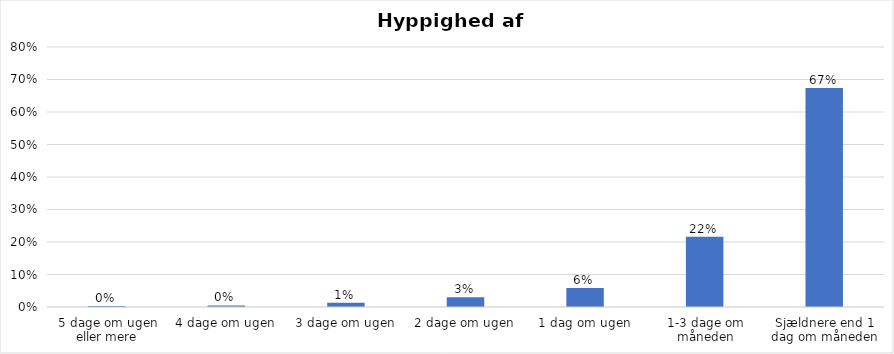
| Category | % |
|---|---|
| 5 dage om ugen eller mere | 0.003 |
| 4 dage om ugen | 0.005 |
| 3 dage om ugen | 0.013 |
| 2 dage om ugen | 0.03 |
| 1 dag om ugen | 0.059 |
| 1-3 dage om måneden | 0.216 |
| Sjældnere end 1 dag om måneden | 0.674 |